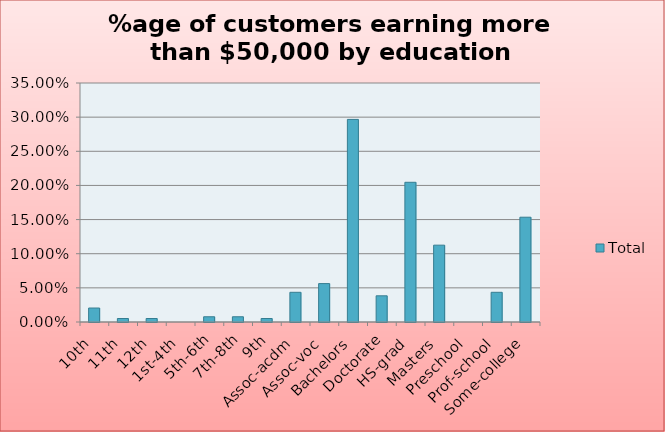
| Category | Total |
|---|---|
| 10th | 0.02 |
| 11th | 0.005 |
| 12th | 0.005 |
| 1st-4th | 0 |
| 5th-6th | 0.008 |
| 7th-8th | 0.008 |
| 9th | 0.005 |
| Assoc-acdm | 0.043 |
| Assoc-voc | 0.056 |
| Bachelors | 0.297 |
| Doctorate | 0.038 |
| HS-grad | 0.205 |
| Masters | 0.113 |
| Preschool | 0 |
| Prof-school | 0.043 |
| Some-college | 0.153 |